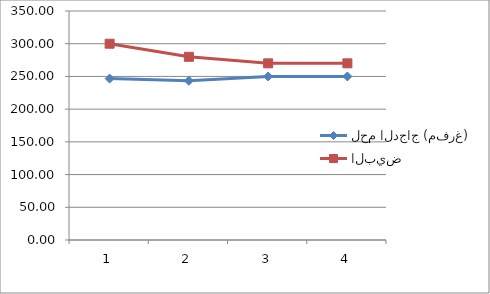
| Category | لحم الدجاج (مفرغ) | البيض |
|---|---|---|
| 0 | 246.67 | 300 |
| 1 | 243.33 | 280 |
| 2 | 250 | 270 |
| 3 | 250 | 270 |